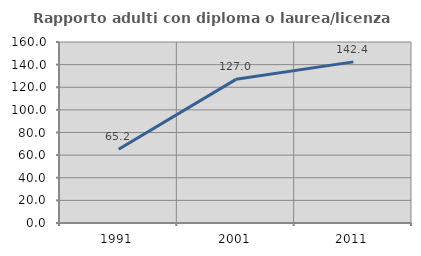
| Category | Rapporto adulti con diploma o laurea/licenza media  |
|---|---|
| 1991.0 | 65.185 |
| 2001.0 | 126.992 |
| 2011.0 | 142.442 |